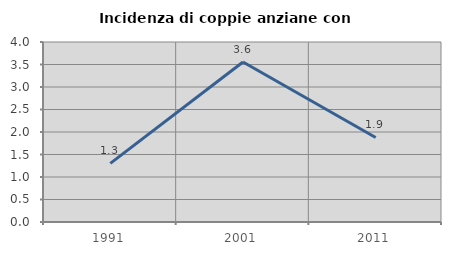
| Category | Incidenza di coppie anziane con figli |
|---|---|
| 1991.0 | 1.302 |
| 2001.0 | 3.556 |
| 2011.0 | 1.878 |